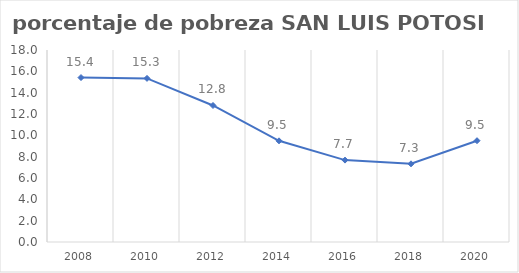
| Category | Series 0 |
|---|---|
| 2008.0 | 15.415 |
| 2010.0 | 15.339 |
| 2012.0 | 12.798 |
| 2014.0 | 9.485 |
| 2016.0 | 7.677 |
| 2018.0 | 7.33 |
| 2020.0 | 9.498 |